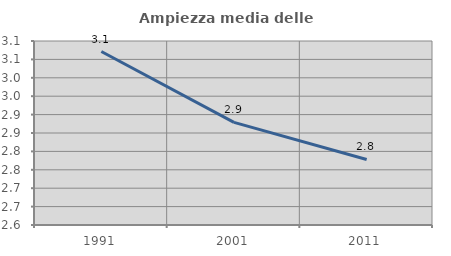
| Category | Ampiezza media delle famiglie |
|---|---|
| 1991.0 | 3.071 |
| 2001.0 | 2.879 |
| 2011.0 | 2.778 |